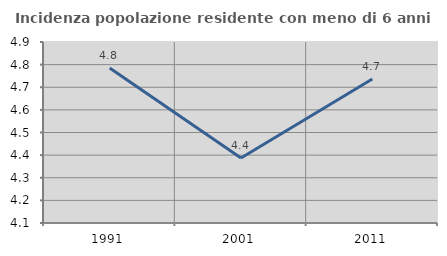
| Category | Incidenza popolazione residente con meno di 6 anni |
|---|---|
| 1991.0 | 4.785 |
| 2001.0 | 4.387 |
| 2011.0 | 4.736 |